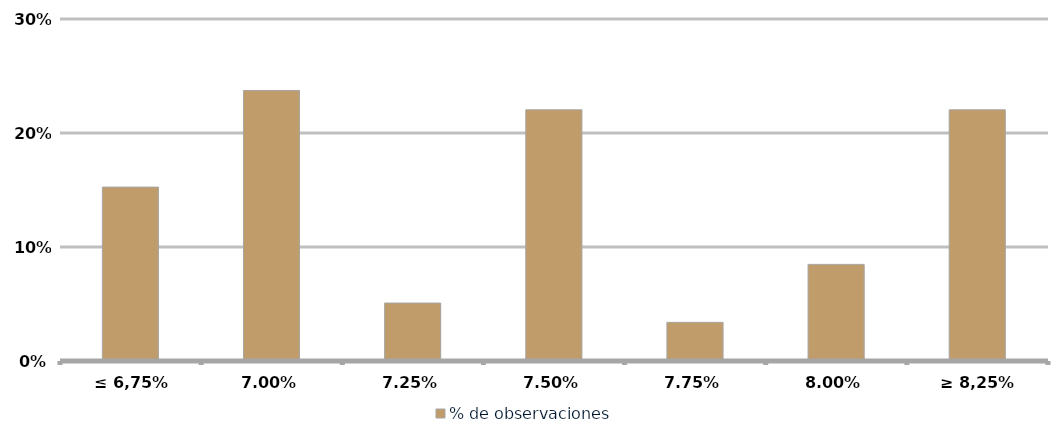
| Category | % de observaciones  |
|---|---|
| ≤ 6,75% | 0.153 |
| 7,00% | 0.237 |
| 7,25% | 0.051 |
| 7,50% | 0.22 |
| 7,75% | 0.034 |
| 8,00% | 0.085 |
| ≥ 8,25% | 0.22 |